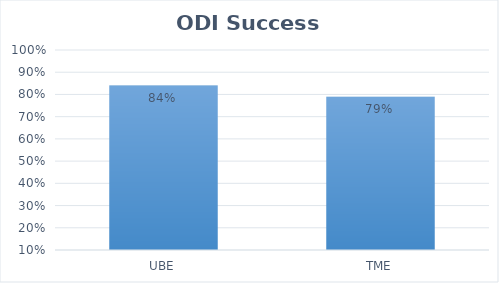
| Category | Series 0 |
|---|---|
| UBE | 0.84 |
| TME | 0.79 |